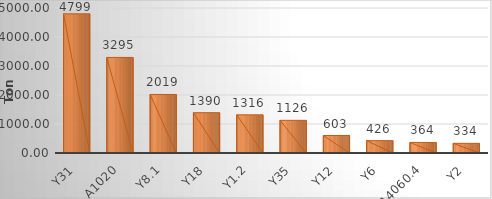
| Category | Series 0 |
|---|---|
| Y31 | 4799.271 |
| A1020 | 3295.455 |
| Y8.1 | 2018.532 |
| Y18 | 1389.608 |
| Y1.2 | 1315.883 |
| Y35 | 1126.289 |
| Y12 | 603.056 |
| Y6 | 426.11 |
| A4060.4 | 363.761 |
| Y2 | 333.639 |